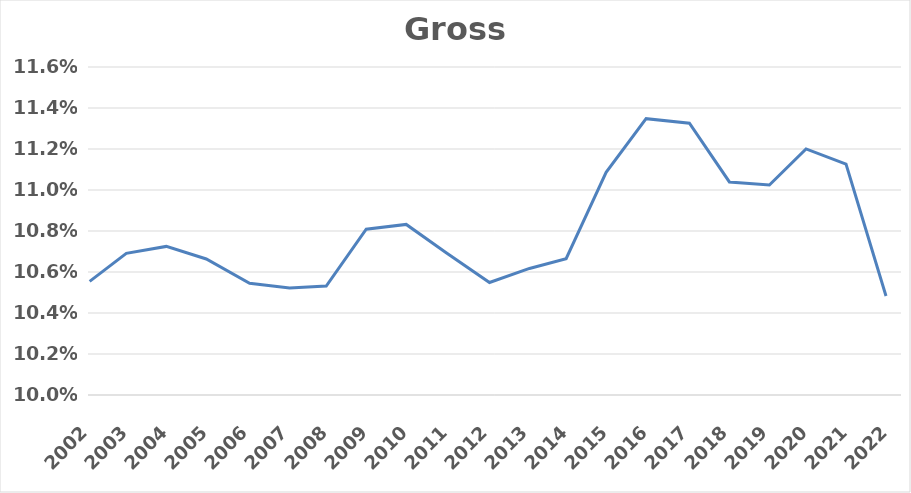
| Category | Gross margin |
|---|---|
| 2022-08-28 | 0.105 |
| 2021-08-29 | 0.111 |
| 2020-08-30 | 0.112 |
| 2019-09-01 | 0.11 |
| 2018-09-02 | 0.11 |
| 2017-09-03 | 0.113 |
| 2016-08-28 | 0.113 |
| 2015-08-30 | 0.111 |
| 2014-08-31 | 0.107 |
| 2013-09-01 | 0.106 |
| 2012-09-02 | 0.105 |
| 2011-08-28 | 0.107 |
| 2010-08-29 | 0.108 |
| 2009-08-30 | 0.108 |
| 2008-08-31 | 0.105 |
| 2007-09-02 | 0.105 |
| 2006-09-03 | 0.105 |
| 2005-08-25 | 0.107 |
| 2004-08-29 | 0.107 |
| 2003-08-31 | 0.107 |
| 2002-09-01 | 0.106 |